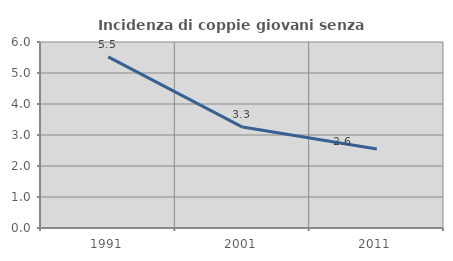
| Category | Incidenza di coppie giovani senza figli |
|---|---|
| 1991.0 | 5.521 |
| 2001.0 | 3.256 |
| 2011.0 | 2.551 |